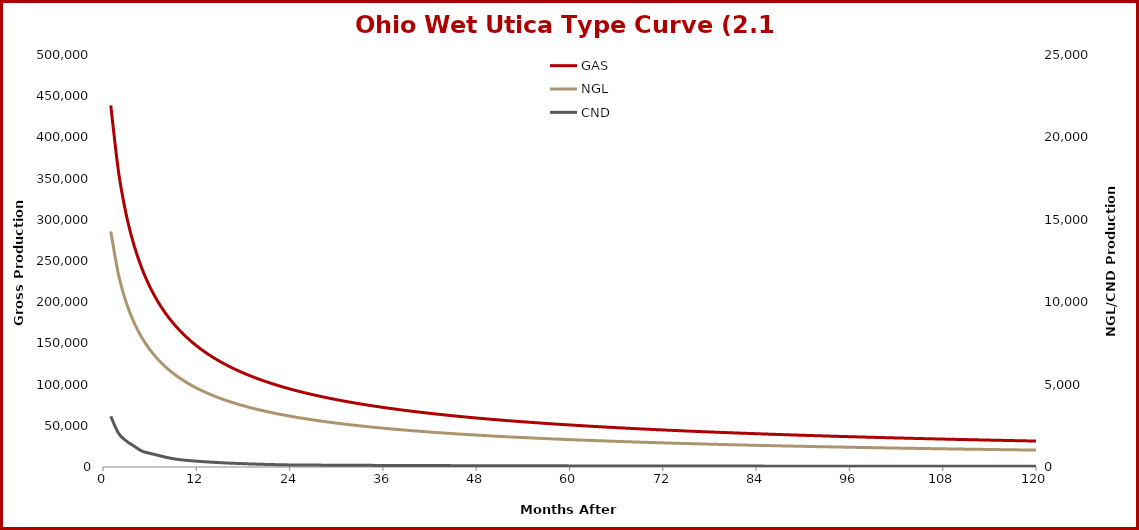
| Category | GAS |
|---|---|
| 1.0 | 438804 |
| 2.0 | 358043 |
| 3.0 | 305773 |
| 4.0 | 268756 |
| 5.0 | 240956 |
| 6.0 | 219195 |
| 7.0 | 201627 |
| 8.0 | 187101 |
| 9.0 | 174858 |
| 10.0 | 164378 |
| 11.0 | 155289 |
| 12.0 | 147321 |
| 13.0 | 140268 |
| 14.0 | 133975 |
| 15.0 | 128320 |
| 16.0 | 123206 |
| 17.0 | 118556 |
| 18.0 | 114306 |
| 19.0 | 110404 |
| 20.0 | 106807 |
| 21.0 | 103479 |
| 22.0 | 100390 |
| 23.0 | 97513 |
| 24.0 | 94826 |
| 25.0 | 92311 |
| 26.0 | 89950 |
| 27.0 | 87729 |
| 28.0 | 85635 |
| 29.0 | 83657 |
| 30.0 | 81786 |
| 31.0 | 80012 |
| 32.0 | 78327 |
| 33.0 | 76725 |
| 34.0 | 75200 |
| 35.0 | 73745 |
| 36.0 | 72357 |
| 37.0 | 71029 |
| 38.0 | 69758 |
| 39.0 | 68541 |
| 40.0 | 67373 |
| 41.0 | 66252 |
| 42.0 | 65175 |
| 43.0 | 64139 |
| 44.0 | 63141 |
| 45.0 | 62180 |
| 46.0 | 61254 |
| 47.0 | 60359 |
| 48.0 | 59496 |
| 49.0 | 58662 |
| 50.0 | 57855 |
| 51.0 | 57074 |
| 52.0 | 56318 |
| 53.0 | 55586 |
| 54.0 | 54876 |
| 55.0 | 54187 |
| 56.0 | 53519 |
| 57.0 | 52870 |
| 58.0 | 52240 |
| 59.0 | 51628 |
| 60.0 | 51032 |
| 61.0 | 50453 |
| 62.0 | 49889 |
| 63.0 | 49341 |
| 64.0 | 48806 |
| 65.0 | 48285 |
| 66.0 | 47778 |
| 67.0 | 47282 |
| 68.0 | 46799 |
| 69.0 | 46328 |
| 70.0 | 45868 |
| 71.0 | 45419 |
| 72.0 | 44980 |
| 73.0 | 44551 |
| 74.0 | 44132 |
| 75.0 | 43722 |
| 76.0 | 43322 |
| 77.0 | 42930 |
| 78.0 | 42546 |
| 79.0 | 42171 |
| 80.0 | 41803 |
| 81.0 | 41443 |
| 82.0 | 41090 |
| 83.0 | 40745 |
| 84.0 | 40406 |
| 85.0 | 40074 |
| 86.0 | 39748 |
| 87.0 | 39429 |
| 88.0 | 39116 |
| 89.0 | 38809 |
| 90.0 | 38507 |
| 91.0 | 38211 |
| 92.0 | 37921 |
| 93.0 | 37635 |
| 94.0 | 37355 |
| 95.0 | 37080 |
| 96.0 | 36809 |
| 97.0 | 36544 |
| 98.0 | 36282 |
| 99.0 | 36026 |
| 100.0 | 35773 |
| 101.0 | 35525 |
| 102.0 | 35281 |
| 103.0 | 35041 |
| 104.0 | 34804 |
| 105.0 | 34572 |
| 106.0 | 34343 |
| 107.0 | 34118 |
| 108.0 | 33896 |
| 109.0 | 33678 |
| 110.0 | 33463 |
| 111.0 | 33251 |
| 112.0 | 33043 |
| 113.0 | 32838 |
| 114.0 | 32635 |
| 115.0 | 32436 |
| 116.0 | 32239 |
| 117.0 | 32046 |
| 118.0 | 31855 |
| 119.0 | 31667 |
| 120.0 | 31481 |
| 121.0 | 31298 |
| 122.0 | 31118 |
| 123.0 | 30940 |
| 124.0 | 30765 |
| 125.0 | 30591 |
| 126.0 | 30421 |
| 127.0 | 30252 |
| 128.0 | 30086 |
| 129.0 | 29922 |
| 130.0 | 29760 |
| 131.0 | 29600 |
| 132.0 | 29442 |
| 133.0 | 29286 |
| 134.0 | 29132 |
| 135.0 | 28980 |
| 136.0 | 28830 |
| 137.0 | 28682 |
| 138.0 | 28534 |
| 139.0 | 28387 |
| 140.0 | 28241 |
| 141.0 | 28096 |
| 142.0 | 27952 |
| 143.0 | 27808 |
| 144.0 | 27665 |
| 145.0 | 27523 |
| 146.0 | 27381 |
| 147.0 | 27240 |
| 148.0 | 27100 |
| 149.0 | 26961 |
| 150.0 | 26822 |
| 151.0 | 26684 |
| 152.0 | 26547 |
| 153.0 | 26410 |
| 154.0 | 26275 |
| 155.0 | 26139 |
| 156.0 | 26005 |
| 157.0 | 25871 |
| 158.0 | 25738 |
| 159.0 | 25606 |
| 160.0 | 25474 |
| 161.0 | 25343 |
| 162.0 | 25213 |
| 163.0 | 25083 |
| 164.0 | 24954 |
| 165.0 | 24826 |
| 166.0 | 24698 |
| 167.0 | 24571 |
| 168.0 | 24445 |
| 169.0 | 24319 |
| 170.0 | 24194 |
| 171.0 | 24070 |
| 172.0 | 23946 |
| 173.0 | 23823 |
| 174.0 | 23700 |
| 175.0 | 23578 |
| 176.0 | 23457 |
| 177.0 | 23336 |
| 178.0 | 23216 |
| 179.0 | 23097 |
| 180.0 | 22978 |
| 181.0 | 22860 |
| 182.0 | 22742 |
| 183.0 | 22625 |
| 184.0 | 22509 |
| 185.0 | 22393 |
| 186.0 | 22278 |
| 187.0 | 22163 |
| 188.0 | 22049 |
| 189.0 | 21936 |
| 190.0 | 21823 |
| 191.0 | 21711 |
| 192.0 | 21599 |
| 193.0 | 21488 |
| 194.0 | 21378 |
| 195.0 | 21268 |
| 196.0 | 21158 |
| 197.0 | 21050 |
| 198.0 | 20941 |
| 199.0 | 20834 |
| 200.0 | 20727 |
| 201.0 | 20620 |
| 202.0 | 20514 |
| 203.0 | 20408 |
| 204.0 | 20303 |
| 205.0 | 20199 |
| 206.0 | 20095 |
| 207.0 | 19992 |
| 208.0 | 19889 |
| 209.0 | 19787 |
| 210.0 | 19685 |
| 211.0 | 19584 |
| 212.0 | 19483 |
| 213.0 | 19383 |
| 214.0 | 19283 |
| 215.0 | 19184 |
| 216.0 | 19085 |
| 217.0 | 18987 |
| 218.0 | 18889 |
| 219.0 | 18792 |
| 220.0 | 18696 |
| 221.0 | 18599 |
| 222.0 | 18504 |
| 223.0 | 18409 |
| 224.0 | 18314 |
| 225.0 | 18220 |
| 226.0 | 18126 |
| 227.0 | 18033 |
| 228.0 | 17940 |
| 229.0 | 17848 |
| 230.0 | 17756 |
| 231.0 | 17665 |
| 232.0 | 17574 |
| 233.0 | 17483 |
| 234.0 | 17394 |
| 235.0 | 17304 |
| 236.0 | 17215 |
| 237.0 | 17127 |
| 238.0 | 17038 |
| 239.0 | 16951 |
| 240.0 | 16864 |
| 241.0 | 16777 |
| 242.0 | 16691 |
| 243.0 | 16605 |
| 244.0 | 16519 |
| 245.0 | 16434 |
| 246.0 | 16350 |
| 247.0 | 16266 |
| 248.0 | 16182 |
| 249.0 | 16099 |
| 250.0 | 16016 |
| 251.0 | 15934 |
| 252.0 | 15852 |
| 253.0 | 15770 |
| 254.0 | 15689 |
| 255.0 | 15609 |
| 256.0 | 15528 |
| 257.0 | 15448 |
| 258.0 | 15369 |
| 259.0 | 15290 |
| 260.0 | 15211 |
| 261.0 | 15133 |
| 262.0 | 15055 |
| 263.0 | 14978 |
| 264.0 | 14901 |
| 265.0 | 14824 |
| 266.0 | 14748 |
| 267.0 | 14672 |
| 268.0 | 14597 |
| 269.0 | 14521 |
| 270.0 | 14447 |
| 271.0 | 14373 |
| 272.0 | 14299 |
| 273.0 | 14225 |
| 274.0 | 14152 |
| 275.0 | 14079 |
| 276.0 | 14007 |
| 277.0 | 13935 |
| 278.0 | 13863 |
| 279.0 | 13792 |
| 280.0 | 13721 |
| 281.0 | 13650 |
| 282.0 | 13580 |
| 283.0 | 13510 |
| 284.0 | 13441 |
| 285.0 | 13372 |
| 286.0 | 13303 |
| 287.0 | 13234 |
| 288.0 | 13166 |
| 289.0 | 13099 |
| 290.0 | 13031 |
| 291.0 | 12964 |
| 292.0 | 12898 |
| 293.0 | 12831 |
| 294.0 | 12765 |
| 295.0 | 12700 |
| 296.0 | 12634 |
| 297.0 | 12569 |
| 298.0 | 12505 |
| 299.0 | 12440 |
| 300.0 | 12376 |
| 301.0 | 12313 |
| 302.0 | 12249 |
| 303.0 | 12186 |
| 304.0 | 12124 |
| 305.0 | 12061 |
| 306.0 | 11999 |
| 307.0 | 11938 |
| 308.0 | 11876 |
| 309.0 | 11815 |
| 310.0 | 11754 |
| 311.0 | 11694 |
| 312.0 | 11634 |
| 313.0 | 11574 |
| 314.0 | 11514 |
| 315.0 | 11455 |
| 316.0 | 11396 |
| 317.0 | 11338 |
| 318.0 | 11279 |
| 319.0 | 11221 |
| 320.0 | 11164 |
| 321.0 | 11106 |
| 322.0 | 11049 |
| 323.0 | 10992 |
| 324.0 | 10936 |
| 325.0 | 10879 |
| 326.0 | 10824 |
| 327.0 | 10768 |
| 328.0 | 10712 |
| 329.0 | 10657 |
| 330.0 | 10603 |
| 331.0 | 10548 |
| 332.0 | 10494 |
| 333.0 | 10440 |
| 334.0 | 10386 |
| 335.0 | 10333 |
| 336.0 | 10280 |
| 337.0 | 10227 |
| 338.0 | 10174 |
| 339.0 | 10122 |
| 340.0 | 10070 |
| 341.0 | 10018 |
| 342.0 | 9966 |
| 343.0 | 9915 |
| 344.0 | 9864 |
| 345.0 | 9813 |
| 346.0 | 9763 |
| 347.0 | 9713 |
| 348.0 | 9663 |
| 349.0 | 9613 |
| 350.0 | 9564 |
| 351.0 | 9514 |
| 352.0 | 9466 |
| 353.0 | 9417 |
| 354.0 | 9368 |
| 355.0 | 9320 |
| 356.0 | 9272 |
| 357.0 | 9225 |
| 358.0 | 9177 |
| 359.0 | 9130 |
| 360.0 | 9083 |
| 361.0 | 9036 |
| 362.0 | 8990 |
| 363.0 | 8944 |
| 364.0 | 8898 |
| 365.0 | 8852 |
| 366.0 | 8806 |
| 367.0 | 8761 |
| 368.0 | 8716 |
| 369.0 | 8671 |
| 370.0 | 8627 |
| 371.0 | 8582 |
| 372.0 | 8538 |
| 373.0 | 8494 |
| 374.0 | 8450 |
| 375.0 | 8407 |
| 376.0 | 8364 |
| 377.0 | 8321 |
| 378.0 | 8278 |
| 379.0 | 8235 |
| 380.0 | 8193 |
| 381.0 | 8151 |
| 382.0 | 8109 |
| 383.0 | 8067 |
| 384.0 | 8026 |
| 385.0 | 7984 |
| 386.0 | 7943 |
| 387.0 | 7903 |
| 388.0 | 7862 |
| 389.0 | 7821 |
| 390.0 | 7781 |
| 391.0 | 7741 |
| 392.0 | 7701 |
| 393.0 | 7662 |
| 394.0 | 7622 |
| 395.0 | 7583 |
| 396.0 | 7544 |
| 397.0 | 7505 |
| 398.0 | 7467 |
| 399.0 | 7428 |
| 400.0 | 7390 |
| 401.0 | 7352 |
| 402.0 | 7314 |
| 403.0 | 7277 |
| 404.0 | 7239 |
| 405.0 | 7202 |
| 406.0 | 7165 |
| 407.0 | 7128 |
| 408.0 | 7092 |
| 409.0 | 7055 |
| 410.0 | 7019 |
| 411.0 | 6983 |
| 412.0 | 6947 |
| 413.0 | 6911 |
| 414.0 | 6876 |
| 415.0 | 6840 |
| 416.0 | 6805 |
| 417.0 | 6770 |
| 418.0 | 6735 |
| 419.0 | 6701 |
| 420.0 | 6666 |
| 421.0 | 6632 |
| 422.0 | 6598 |
| 423.0 | 6564 |
| 424.0 | 6530 |
| 425.0 | 6496 |
| 426.0 | 6463 |
| 427.0 | 6430 |
| 428.0 | 6397 |
| 429.0 | 6364 |
| 430.0 | 6331 |
| 431.0 | 6299 |
| 432.0 | 6266 |
| 433.0 | 6234 |
| 434.0 | 6202 |
| 435.0 | 6170 |
| 436.0 | 6138 |
| 437.0 | 6107 |
| 438.0 | 6075 |
| 439.0 | 6044 |
| 440.0 | 6013 |
| 441.0 | 5982 |
| 442.0 | 5951 |
| 443.0 | 5921 |
| 444.0 | 5890 |
| 445.0 | 5860 |
| 446.0 | 5830 |
| 447.0 | 5800 |
| 448.0 | 5770 |
| 449.0 | 5740 |
| 450.0 | 5711 |
| 451.0 | 5681 |
| 452.0 | 5652 |
| 453.0 | 5623 |
| 454.0 | 5594 |
| 455.0 | 5565 |
| 456.0 | 5537 |
| 457.0 | 5508 |
| 458.0 | 5480 |
| 459.0 | 5452 |
| 460.0 | 5424 |
| 461.0 | 5396 |
| 462.0 | 5368 |
| 463.0 | 5340 |
| 464.0 | 5313 |
| 465.0 | 5286 |
| 466.0 | 5258 |
| 467.0 | 5231 |
| 468.0 | 5205 |
| 469.0 | 5178 |
| 470.0 | 5151 |
| 471.0 | 5125 |
| 472.0 | 5098 |
| 473.0 | 5072 |
| 474.0 | 5046 |
| 475.0 | 5020 |
| 476.0 | 4994 |
| 477.0 | 4969 |
| 478.0 | 4943 |
| 479.0 | 4918 |
| 480.0 | 4892 |
| 481.0 | 4867 |
| 482.0 | 4842 |
| 483.0 | 4817 |
| 484.0 | 4792 |
| 485.0 | 4768 |
| 486.0 | 4743 |
| 487.0 | 4719 |
| 488.0 | 4695 |
| 489.0 | 4670 |
| 490.0 | 4646 |
| 491.0 | 4623 |
| 492.0 | 4599 |
| 493.0 | 4575 |
| 494.0 | 4552 |
| 495.0 | 4528 |
| 496.0 | 4505 |
| 497.0 | 4482 |
| 498.0 | 4459 |
| 499.0 | 4436 |
| 500.0 | 4413 |
| 501.0 | 4390 |
| 502.0 | 4368 |
| 503.0 | 4345 |
| 504.0 | 4323 |
| 505.0 | 4301 |
| 506.0 | 4278 |
| 507.0 | 4256 |
| 508.0 | 4235 |
| 509.0 | 4213 |
| 510.0 | 4191 |
| 511.0 | 4170 |
| 512.0 | 4148 |
| 513.0 | 4127 |
| 514.0 | 4106 |
| 515.0 | 4084 |
| 516.0 | 4063 |
| 517.0 | 4043 |
| 518.0 | 4022 |
| 519.0 | 4001 |
| 520.0 | 3980 |
| 521.0 | 3960 |
| 522.0 | 3940 |
| 523.0 | 3919 |
| 524.0 | 3899 |
| 525.0 | 3879 |
| 526.0 | 3859 |
| 527.0 | 3839 |
| 528.0 | 3820 |
| 529.0 | 3800 |
| 530.0 | 3780 |
| 531.0 | 3761 |
| 532.0 | 3742 |
| 533.0 | 3722 |
| 534.0 | 3703 |
| 535.0 | 3684 |
| 536.0 | 3665 |
| 537.0 | 3646 |
| 538.0 | 3628 |
| 539.0 | 3609 |
| 540.0 | 3590 |
| 541.0 | 3572 |
| 542.0 | 3554 |
| 543.0 | 3535 |
| 544.0 | 3517 |
| 545.0 | 3499 |
| 546.0 | 3481 |
| 547.0 | 3463 |
| 548.0 | 3445 |
| 549.0 | 3428 |
| 550.0 | 3410 |
| 551.0 | 3392 |
| 552.0 | 3375 |
| 553.0 | 3358 |
| 554.0 | 3340 |
| 555.0 | 3323 |
| 556.0 | 3306 |
| 557.0 | 3289 |
| 558.0 | 3272 |
| 559.0 | 3255 |
| 560.0 | 3239 |
| 561.0 | 3222 |
| 562.0 | 3205 |
| 563.0 | 3189 |
| 564.0 | 3173 |
| 565.0 | 3156 |
| 566.0 | 3140 |
| 567.0 | 3124 |
| 568.0 | 3108 |
| 569.0 | 3092 |
| 570.0 | 3076 |
| 571.0 | 3060 |
| 572.0 | 3044 |
| 573.0 | 3029 |
| 574.0 | 3013 |
| 575.0 | 2998 |
| 576.0 | 2982 |
| 577.0 | 2967 |
| 578.0 | 2952 |
| 579.0 | 2936 |
| 580.0 | 2921 |
| 581.0 | 2906 |
| 582.0 | 2891 |
| 583.0 | 2876 |
| 584.0 | 2862 |
| 585.0 | 2847 |
| 586.0 | 2832 |
| 587.0 | 2818 |
| 588.0 | 2803 |
| 589.0 | 2789 |
| 590.0 | 2774 |
| 591.0 | 2760 |
| 592.0 | 2746 |
| 593.0 | 2732 |
| 594.0 | 2718 |
| 595.0 | 2704 |
| 596.0 | 2690 |
| 597.0 | 2676 |
| 598.0 | 2662 |
| 599.0 | 2649 |
| 600.0 | 2635 |
| 601.0 | 2621.49 |
| 602.0 | 2608.01 |
| 603.0 | 2594.6 |
| 604.0 | 2581.25 |
| 605.0 | 2567.98 |
| 606.0 | 2554.77 |
| 607.0 | 2541.63 |
| 608.0 | 2528.56 |
| 609.0 | 2515.55 |
| 610.0 | 2502.62 |
| 611.0 | 2489.75 |
| 612.0 | 2476.94 |
| 613.0 | 2464.2 |
| 614.0 | 2451.53 |
| 615.0 | 2438.92 |
| 616.0 | 2426.38 |
| 617.0 | 2413.9 |
| 618.0 | 2401.48 |
| 619.0 | 2389.13 |
| 620.0 | 2376.84 |
| 621.0 | 2364.62 |
| 622.0 | 2352.46 |
| 623.0 | 2340.36 |
| 624.0 | 2328.32 |
| 625.0 | 2316.35 |
| 626.0 | 2304.44 |
| 627.0 | 2292.58 |
| 628.0 | 2280.79 |
| 629.0 | 2269.06 |
| 630.0 | 2257.39 |
| 631.0 | 2245.78 |
| 632.0 | 2234.23 |
| 633.0 | 2222.74 |
| 634.0 | 2211.31 |
| 635.0 | 2199.94 |
| 636.0 | 2188.62 |
| 637.0 | 2177.37 |
| 638.0 | 2166.17 |
| 639.0 | 2155.03 |
| 640.0 | 2143.95 |
| 641.0 | 2132.92 |
| 642.0 | 2121.95 |
| 643.0 | 2111.04 |
| 644.0 | 2100.18 |
| 645.0 | 2089.38 |
| 646.0 | 2078.63 |
| 647.0 | 2067.94 |
| 648.0 | 2057.31 |
| 649.0 | 2046.73 |
| 650.0 | 2036.2 |
| 651.0 | 2025.73 |
| 652.0 | 2015.31 |
| 653.0 | 2004.94 |
| 654.0 | 1994.63 |
| 655.0 | 1984.37 |
| 656.0 | 1974.17 |
| 657.0 | 1964.02 |
| 658.0 | 1953.91 |
| 659.0 | 1943.87 |
| 660.0 | 1933.87 |
| 661.0 | 1923.92 |
| 662.0 | 1914.03 |
| 663.0 | 1904.18 |
| 664.0 | 1894.39 |
| 665.0 | 1884.65 |
| 666.0 | 1874.96 |
| 667.0 | 1865.31 |
| 668.0 | 1855.72 |
| 669.0 | 1846.17 |
| 670.0 | 1836.68 |
| 671.0 | 1827.23 |
| 672.0 | 1817.84 |
| 673.0 | 1808.49 |
| 674.0 | 1799.19 |
| 675.0 | 1789.93 |
| 676.0 | 1780.73 |
| 677.0 | 1771.57 |
| 678.0 | 1762.46 |
| 679.0 | 1753.39 |
| 680.0 | 1744.38 |
| 681.0 | 1735.4 |
| 682.0 | 1726.48 |
| 683.0 | 1717.6 |
| 684.0 | 1708.77 |
| 685.0 | 1699.98 |
| 686.0 | 1691.24 |
| 687.0 | 1682.54 |
| 688.0 | 1673.88 |
| 689.0 | 1665.28 |
| 690.0 | 1656.71 |
| 691.0 | 1648.19 |
| 692.0 | 1639.71 |
| 693.0 | 1631.28 |
| 694.0 | 1622.89 |
| 695.0 | 1614.54 |
| 696.0 | 1606.24 |
| 697.0 | 1597.98 |
| 698.0 | 1589.76 |
| 699.0 | 1581.58 |
| 700.0 | 1573.45 |
| 701.0 | 1565.36 |
| 702.0 | 1557.31 |
| 703.0 | 1549.3 |
| 704.0 | 1541.33 |
| 705.0 | 1533.4 |
| 706.0 | 1525.52 |
| 707.0 | 1517.67 |
| 708.0 | 1509.87 |
| 709.0 | 1502.1 |
| 710.0 | 1494.38 |
| 711.0 | 1486.69 |
| 712.0 | 1479.04 |
| 713.0 | 1471.44 |
| 714.0 | 1463.87 |
| 715.0 | 1456.34 |
| 716.0 | 1448.85 |
| 717.0 | 1441.4 |
| 718.0 | 1433.99 |
| 719.0 | 1426.61 |
| 720.0 | 1419.27 |
| 721.0 | 1411.97 |
| 722.0 | 1404.71 |
| 723.0 | 1397.49 |
| 724.0 | 1390.3 |
| 725.0 | 1383.15 |
| 726.0 | 1376.04 |
| 727.0 | 1368.96 |
| 728.0 | 1361.92 |
| 729.0 | 1354.92 |
| 730.0 | 1347.95 |
| 731.0 | 1341.01 |
| 732.0 | 1334.12 |
| 733.0 | 1327.26 |
| 734.0 | 1320.43 |
| 735.0 | 1313.64 |
| 736.0 | 1306.88 |
| 737.0 | 1300.16 |
| 738.0 | 1293.48 |
| 739.0 | 1286.82 |
| 740.0 | 1280.2 |
| 741.0 | 1273.62 |
| 742.0 | 1267.07 |
| 743.0 | 1260.55 |
| 744.0 | 1254.07 |
| 745.0 | 1247.62 |
| 746.0 | 1241.2 |
| 747.0 | 1234.82 |
| 748.0 | 1228.47 |
| 749.0 | 1222.15 |
| 750.0 | 1215.87 |
| 751.0 | 1209.61 |
| 752.0 | 1203.39 |
| 753.0 | 1197.2 |
| 754.0 | 1191.05 |
| 755.0 | 1184.92 |
| 756.0 | 1178.83 |
| 757.0 | 1172.76 |
| 758.0 | 1166.73 |
| 759.0 | 1160.73 |
| 760.0 | 1154.76 |
| 761.0 | 1148.82 |
| 762.0 | 1142.91 |
| 763.0 | 1137.04 |
| 764.0 | 1131.19 |
| 765.0 | 1125.37 |
| 766.0 | 1119.58 |
| 767.0 | 1113.83 |
| 768.0 | 1108.1 |
| 769.0 | 1102.4 |
| 770.0 | 1096.73 |
| 771.0 | 1091.09 |
| 772.0 | 1085.48 |
| 773.0 | 1079.89 |
| 774.0 | 1074.34 |
| 775.0 | 1068.81 |
| 776.0 | 1063.32 |
| 777.0 | 1057.85 |
| 778.0 | 1052.41 |
| 779.0 | 1047 |
| 780.0 | 1041.61 |